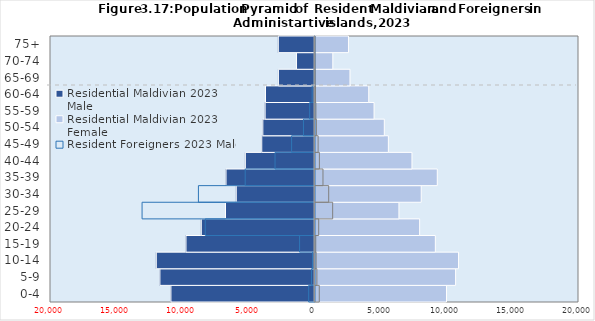
| Category | Residential Maldivian 2023 | Resident Foreigners 2023 |
|---|---|---|
|   0-4 | 9962 | 324.053 |
|   5-9 | 10652 | 142.321 |
|  10-14 | 10874 | 83.203 |
|  15-19 | 9116 | 56.928 |
|  20-24 | 7928 | 280.262 |
|  25-29 | 6358 | 1337.814 |
|  30-34 | 8048 | 1037.846 |
|  35-39 | 9264 | 604.315 |
|  40-44 | 7345 | 332.811 |
|  45-49 | 5558 | 236.471 |
|  50-54 | 5250 | 105.098 |
|  55-59 | 4474 | 67.876 |
|  60-64 | 4071 | 37.222 |
|  65-69 | 2650 | 10.948 |
|  70-74 | 1350 | 2.19 |
|  75+ | 2536 | 2.19 |